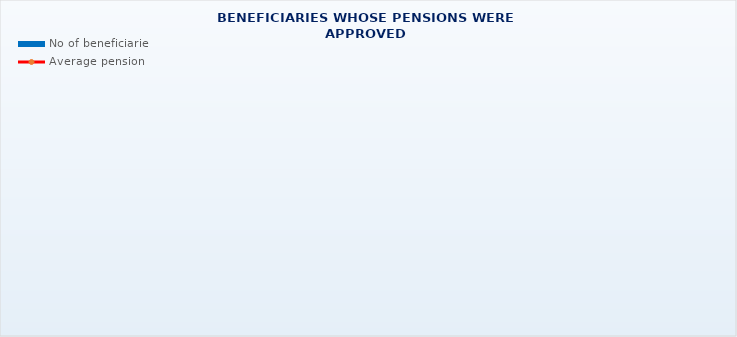
| Category | No of beneficiaries |
|---|---|
| Authorised officials in internal affairs, judicial officers and workers engaged in demining work: | 17264 |
| Pension beneficiaries entitled under the Fire Services Act (Official Gazette 125/19) | 292 |
| Active military personnel - DVO  | 16045 |
| Croatian Homeland Army veterans mobilised from 1941 to 1945 | 2317 |
| Former political prisoners | 2273 |
| Croatian Veterans from the Homeland War - ZOHBDR (Act on Croatian Homeland War Veterans and Their Family Members) | 71180 |
| Pensions approved under general regulations and determined according to the Act on the Rights of Croatian Homeland War Veterans and their Family Members (ZOHBDR), in 2017 (Art. 27, 35, 48 and 49, paragraph 2)    | 54573 |
| Former Yugoslav People's Army members - JNA   | 4084 |
| Former Yugoslav People's Army members - JNA - Art. 185 of Pension Insurance Act (ZOMO)  | 158 |
| National Liberation War veterans - NOR | 5913 |
| Members of the Croatian Parliament, members of the Government, judges of the Constitutional Court and the Auditor General | 687 |
| Members of the Parliamentary Executive Council and administratively retired federal civil servants  (relates to the former SFRY) | 70 |
| Former officials of federal bodies o the former SFRJ -  Article 38 of the Pension Insurance Act (ZOMO) | 22 |
| Full members of the Croatian Academy of Sciences and Arts - HAZU | 129 |
| Miners from the Istrian coal mines "Tupljak" d.d. Labin  | 248 |
| Workers professionally exposed to asbestos | 833 |
| Insurees - crew members on a ship in international and national navigation  - Article  129, paragraph 2 of the Maritime Code | 201 |
| Members of the Croatian Defence Council - HVO  | 6767 |